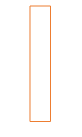
| Category | Series 0 | Series 1 |
|---|---|---|
| 0 | 0 | 1 |